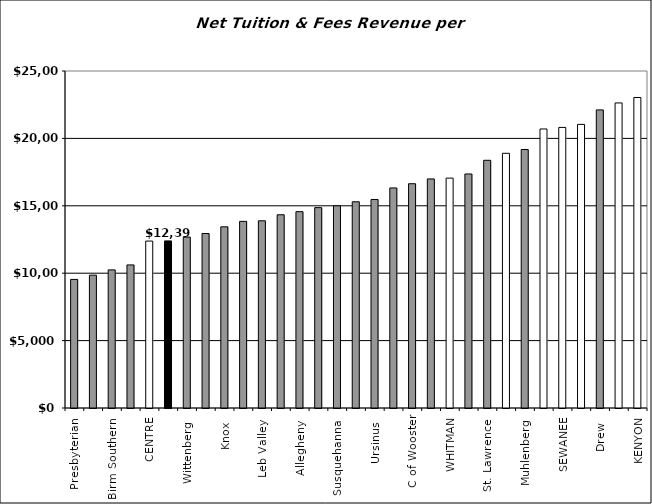
| Category | Series 0 |
|---|---|
| Presbyterian  | 9537.736 |
| Millsaps  | 9853.83 |
| Birm Southern  | 10246.489 |
| Westminster  | 10614.233 |
| CENTRE | 12383.847 |
| Juniata  | 12396 |
| Wittenberg  | 12678.243 |
| Lycoming  | 12944.649 |
| Knox  | 13440.846 |
| Augustana  | 13844.615 |
| Leb Valley  | 13887.073 |
| Elizabethtown  | 14334.065 |
| Allegheny  | 14566.112 |
| Wash & Jeff | 14863.968 |
| Susquehanna  | 15001.963 |
| Moravian | 15298.707 |
| Ursinus  | 15469.603 |
| Wofford  | 16324.583 |
| C of Wooster | 16637.573 |
| Washington  | 16993.569 |
| WHITMAN | 17053.545 |
| McDaniel  | 17360.943 |
| St. Lawrence  | 18376.715 |
| UNION | 18894.799 |
| Muhlenberg  | 19176.038 |
| GETTYSBURG | 20700.574 |
| SEWANEE | 20814.74 |
| DICKINSON | 21039.528 |
| Drew  | 22114.186 |
| F & M * | 22630.062 |
| KENYON | 23034.32 |